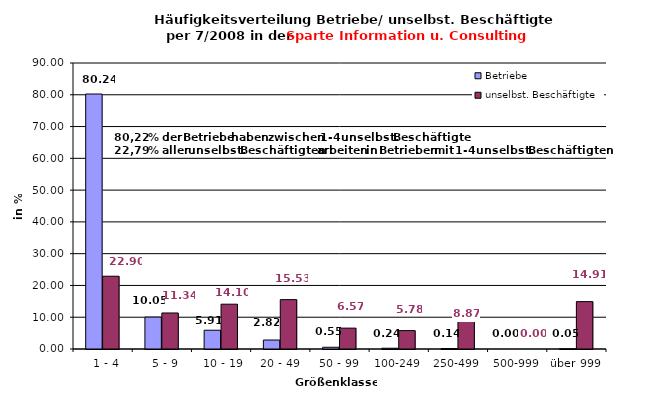
| Category | Betriebe | unselbst. Beschäftigte |
|---|---|---|
|   1 - 4 | 80.239 | 22.9 |
|   5 - 9 | 10.048 | 11.336 |
|  10 - 19 | 5.909 | 14.098 |
| 20 - 49 | 2.823 | 15.533 |
| 50 - 99 | 0.55 | 6.565 |
| 100-249 | 0.239 | 5.784 |
| 250-499 | 0.144 | 8.874 |
| 500-999 | 0 | 0 |
| über 999 | 0.048 | 14.909 |